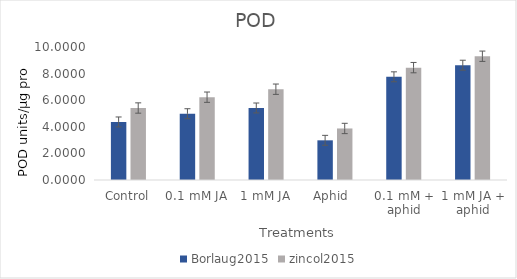
| Category | Borlaug2015 | zincol2015 |
|---|---|---|
| Control | 4.365 | 5.412 |
| 0.1 mM JA | 4.985 | 6.226 |
| 1 mM JA | 5.415 | 6.826 |
| Aphid  | 2.983 | 3.875 |
| 0.1 mM + aphid | 7.759 | 8.449 |
| 1 mM JA + aphid | 8.632 | 9.306 |